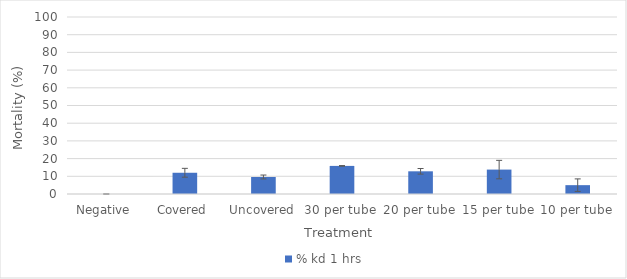
| Category | % kd 1 hrs |
|---|---|
| Negative  | 0 |
| Covered | 12 |
| Uncovered | 9.615 |
| 30 per tube | 15.873 |
| 20 per tube | 12.821 |
| 15 per tube | 13.793 |
| 10 per tube | 5 |